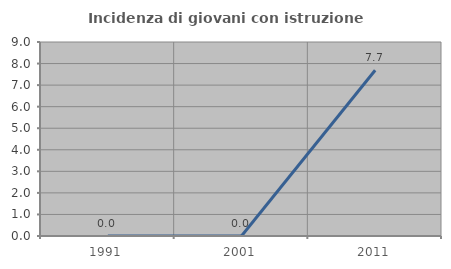
| Category | Incidenza di giovani con istruzione universitaria |
|---|---|
| 1991.0 | 0 |
| 2001.0 | 0 |
| 2011.0 | 7.692 |